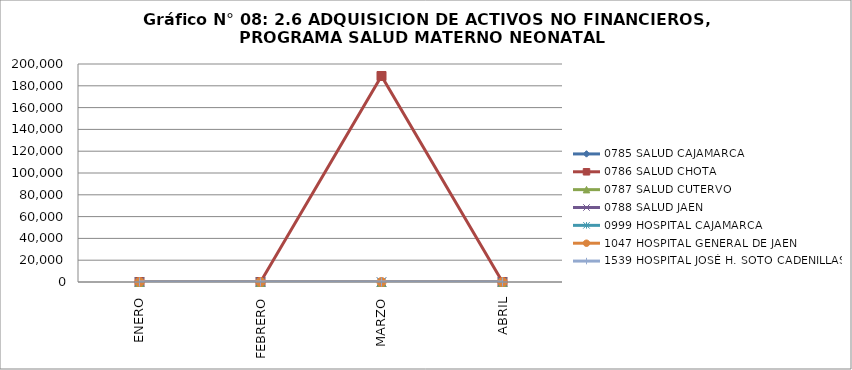
| Category | 0785 SALUD CAJAMARCA | 0786 SALUD CHOTA | 0787 SALUD CUTERVO | 0788 SALUD JAEN | 0999 HOSPITAL CAJAMARCA | 1047 HOSPITAL GENERAL DE JAEN | 1539 HOSPITAL JOSÉ H. SOTO CADENILLAS |
|---|---|---|---|---|---|---|---|
| ENERO | 0 | 0 | 0 | 0 | 0 | 0 | 0 |
| FEBRERO | 0 | 0 | 0 | 0 | 0 | 0 | 0 |
| MARZO | 0 | 189000 | 0 | 0 | 0 | 0 | 0 |
| ABRIL | 0 | 0 | 0 | 0 | 0 | 0 | 0 |